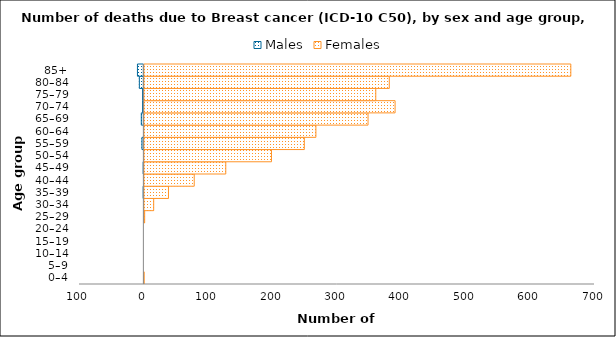
| Category | Males | Females |
|---|---|---|
| 0–4 | 0 | 1 |
| 5–9 | 0 | 0 |
| 10–14 | 0 | 0 |
| 15–19 | 0 | 0 |
| 20–24 | 0 | 0 |
| 25–29 | 0 | 2 |
| 30–34 | 0 | 16 |
| 35–39 | -1 | 39 |
| 40–44 | 0 | 79 |
| 45–49 | -1 | 128 |
| 50–54 | 0 | 199 |
| 55–59 | -3 | 250 |
| 60–64 | 0 | 268 |
| 65–69 | -4 | 349 |
| 70–74 | -2 | 391 |
| 75–79 | -2 | 361 |
| 80–84 | -7 | 382 |
| 85+ | -10 | 664 |